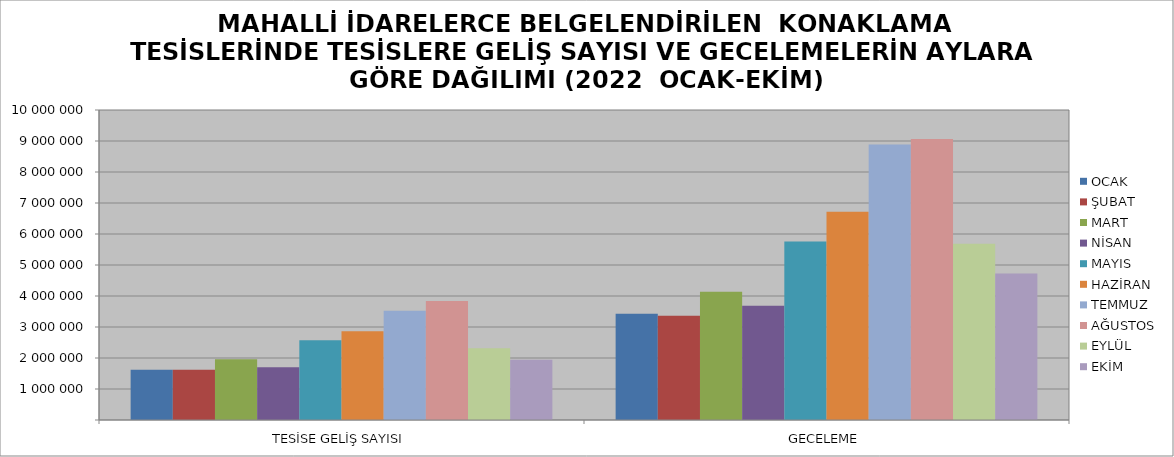
| Category | OCAK | ŞUBAT | MART | NİSAN | MAYIS | HAZİRAN | TEMMUZ | AĞUSTOS | EYLÜL | EKİM |
|---|---|---|---|---|---|---|---|---|---|---|
| TESİSE GELİŞ SAYISI | 1617436 | 1619305 | 1960867 | 1699422 | 2574819 | 2859746 | 3526528 | 3842457 | 2312458 | 1946191 |
| GECELEME | 3427709 | 3362025 | 4136510 | 3684991 | 5758959 | 6716122 | 8890725 | 9063514 | 5685276 | 4729262 |